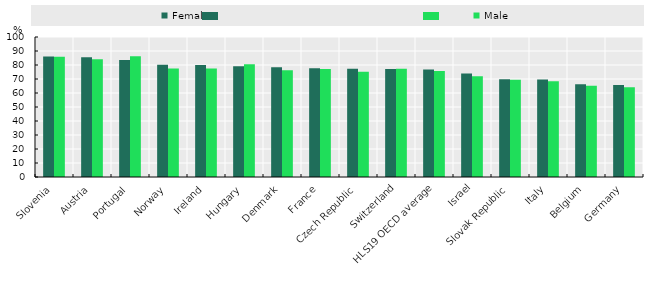
| Category | Female | Male |
|---|---|---|
| Slovenia | 86.09 | 85.84 |
| Austria | 85.53 | 84.12 |
| Portugal | 83.49 | 86.29 |
| Norway | 80.14 | 77.42 |
| Ireland | 80.03 | 77.52 |
| Hungary | 79.04 | 80.61 |
| Denmark | 78.42 | 76.23 |
| France | 77.73 | 77.16 |
| Czech Republic | 77.38 | 75.15 |
| Switzerland | 77.15 | 77.36 |
| HLS19 OECD average | 76.699 | 75.792 |
| Israel | 73.85 | 72.02 |
| Slovak Republic | 69.87 | 69.47 |
| Italy | 69.73 | 68.44 |
| Belgium | 66.3 | 65.17 |
| Germany | 65.74 | 64.08 |